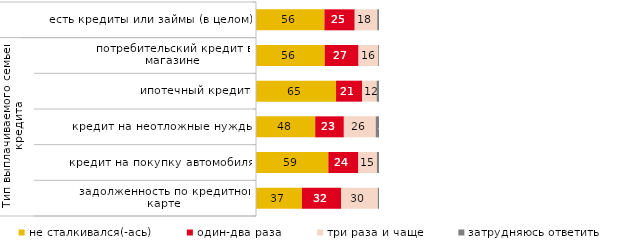
| Category | не сталкивался(-ась) | один-два раза | три раза и чаще | затрудняюсь ответить |
|---|---|---|---|---|
| 0 | 55.648 | 24.614 | 18.312 | 1.427 |
| 1 | 55.932 | 27.458 | 15.932 | 0.678 |
| 2 | 65.094 | 21.226 | 11.792 | 1.887 |
| 3 | 48.148 | 23.28 | 25.926 | 2.646 |
| 4 | 58.824 | 24.37 | 15.126 | 1.681 |
| 5 | 37.383 | 31.776 | 29.907 | 0.935 |